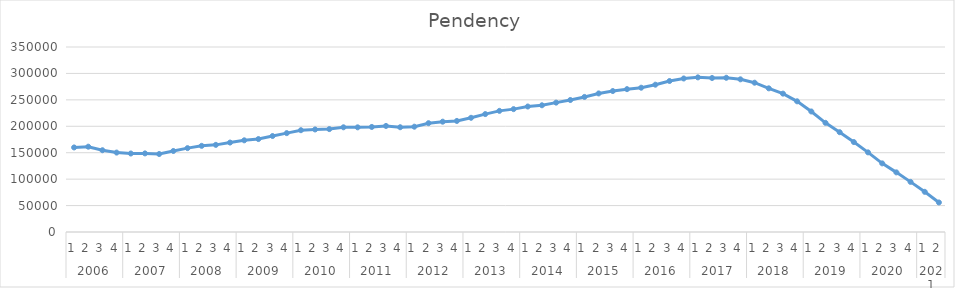
| Category | Pendency |
|---|---|
| 0 | 159976 |
| 1 | 161396 |
| 2 | 154692 |
| 3 | 150263 |
| 4 | 148512 |
| 5 | 148712 |
| 6 | 147537 |
| 7 | 153247 |
| 8 | 158692 |
| 9 | 163002 |
| 10 | 164863 |
| 11 | 169214 |
| 12 | 173454 |
| 13 | 175846 |
| 14 | 181585 |
| 15 | 187050 |
| 16 | 192574 |
| 17 | 194000 |
| 18 | 194691 |
| 19 | 198084 |
| 20 | 198027 |
| 21 | 198757 |
| 22 | 200634 |
| 23 | 198214 |
| 24 | 199229 |
| 25 | 205868 |
| 26 | 208700 |
| 27 | 210101 |
| 28 | 216068 |
| 29 | 223067 |
| 30 | 229176 |
| 31 | 232459 |
| 32 | 237413 |
| 33 | 239745 |
| 34 | 244762 |
| 35 | 249701 |
| 36 | 255525 |
| 37 | 262148 |
| 38 | 266681 |
| 39 | 270272 |
| 40 | 272971 |
| 41 | 278695 |
| 42 | 285663 |
| 43 | 290415.322 |
| 44 | 292543.343 |
| 45 | 291346.47 |
| 46 | 291790.471 |
| 47 | 288847.132 |
| 48 | 282441.588 |
| 49 | 271789.455 |
| 50 | 261764.33 |
| 51 | 247236.616 |
| 52 | 228019.92 |
| 53 | 206505.273 |
| 54 | 188816.082 |
| 55 | 170142.592 |
| 56 | 150650.24 |
| 57 | 129818.979 |
| 58 | 112813.173 |
| 59 | 94823.068 |
| 60 | 76014.102 |
| 61 | 55866.227 |